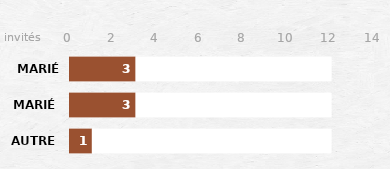
| Category | Series 2 | Series 3 | Series 1 | Series 0 |
|---|---|---|---|---|
| AUTRE | 12 | 1 | 12 | 1 |
| MARIÉ | 12 | 3 | 12 | 3 |
| MARIÉE | 12 | 3 | 12 | 3 |